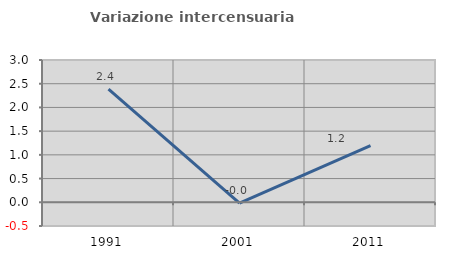
| Category | Variazione intercensuaria annua |
|---|---|
| 1991.0 | 2.385 |
| 2001.0 | -0.019 |
| 2011.0 | 1.195 |